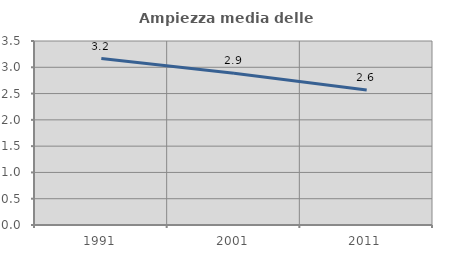
| Category | Ampiezza media delle famiglie |
|---|---|
| 1991.0 | 3.165 |
| 2001.0 | 2.886 |
| 2011.0 | 2.569 |